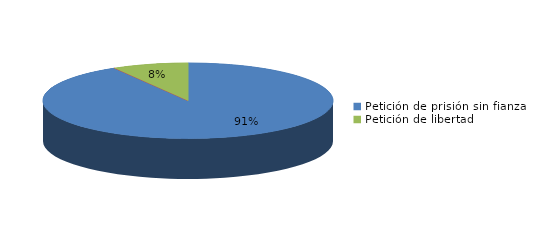
| Category | Series 0 |
|---|---|
| Petición de prisión sin fianza | 2006 |
| Peticion de libertad con fianza | 2 |
| Petición de libertad | 185 |